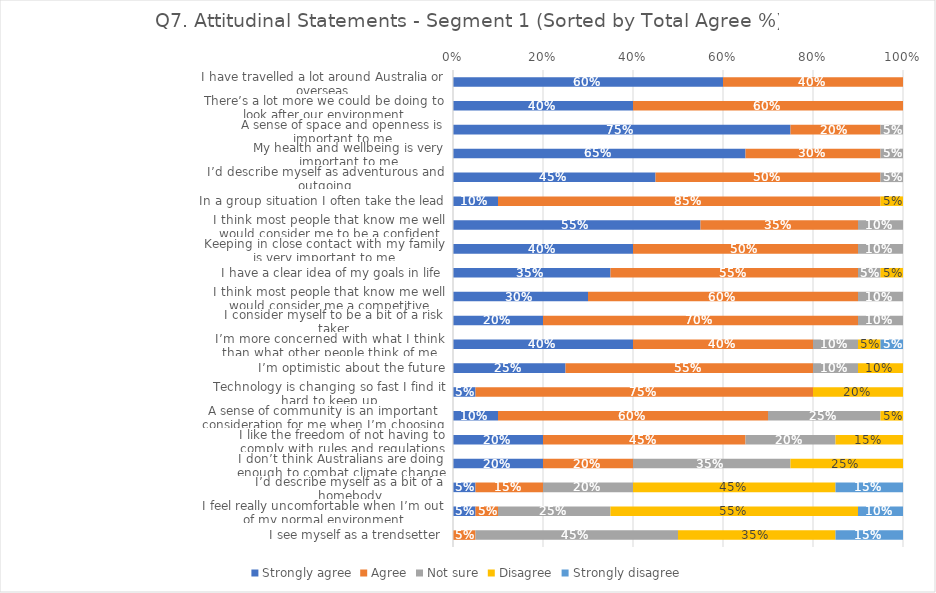
| Category | Strongly agree | Agree | Not sure | Disagree | Strongly disagree |
|---|---|---|---|---|---|
| I have travelled a lot around Australia or overseas | 0.6 | 0.4 | 0 | 0 | 0 |
| There’s a lot more we could be doing to look after our environment | 0.4 | 0.6 | 0 | 0 | 0 |
| A sense of space and openness is important to me | 0.75 | 0.2 | 0.05 | 0 | 0 |
| My health and wellbeing is very important to me | 0.65 | 0.3 | 0.05 | 0 | 0 |
| I’d describe myself as adventurous and outgoing | 0.45 | 0.5 | 0.05 | 0 | 0 |
| In a group situation I often take the lead | 0.1 | 0.85 | 0 | 0.05 | 0 |
| I think most people that know me well would consider me to be a confident person | 0.55 | 0.35 | 0.1 | 0 | 0 |
| Keeping in close contact with my family is very important to me | 0.4 | 0.5 | 0.1 | 0 | 0 |
| I have a clear idea of my goals in life | 0.35 | 0.55 | 0.05 | 0.05 | 0 |
| I think most people that know me well would consider me a competitive person | 0.3 | 0.6 | 0.1 | 0 | 0 |
| I consider myself to be a bit of a risk taker | 0.2 | 0.7 | 0.1 | 0 | 0 |
| I’m more concerned with what I think, than what other people think of me | 0.4 | 0.4 | 0.1 | 0.05 | 0.05 |
| I’m optimistic about the future | 0.25 | 0.55 | 0.1 | 0.1 | 0 |
| Technology is changing so fast I find it hard to keep up | 0.05 | 0.75 | 0 | 0.2 | 0 |
| A sense of community is an important consideration for me when I’m choosing somewhere to live | 0.1 | 0.6 | 0.25 | 0.05 | 0 |
| I like the freedom of not having to comply with rules and regulations | 0.2 | 0.45 | 0.2 | 0.15 | 0 |
| I don’t think Australians are doing enough to combat climate change | 0.2 | 0.2 | 0.35 | 0.25 | 0 |
| I’d describe myself as a bit of a homebody | 0.05 | 0.15 | 0.2 | 0.45 | 0.15 |
| I feel really uncomfortable when I’m out of my normal environment | 0.05 | 0.05 | 0.25 | 0.55 | 0.1 |
| I see myself as a trendsetter | 0 | 0.05 | 0.45 | 0.35 | 0.15 |